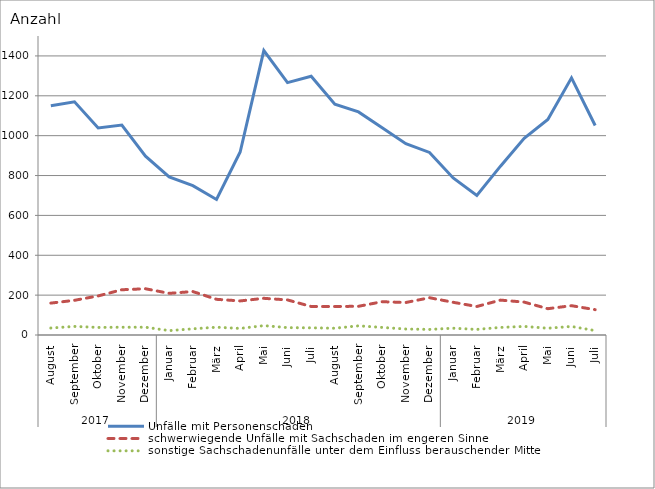
| Category | Unfälle mit Personenschaden | schwerwiegende Unfälle mit Sachschaden im engeren Sinne | sonstige Sachschadenunfälle unter dem Einfluss berauschender Mittel |
|---|---|---|---|
| 0 | 1150 | 160 | 35 |
| 1 | 1170 | 174 | 43 |
| 2 | 1039 | 196 | 38 |
| 3 | 1053 | 227 | 39 |
| 4 | 897 | 232 | 39 |
| 5 | 793 | 209 | 22 |
| 6 | 749 | 218 | 31 |
| 7 | 680 | 179 | 39 |
| 8 | 918 | 171 | 33 |
| 9 | 1427 | 184 | 47 |
| 10 | 1266 | 176 | 37 |
| 11 | 1298 | 143 | 36 |
| 12 | 1158 | 143 | 34 |
| 13 | 1119 | 144 | 46 |
| 14 | 1040 | 167 | 38 |
| 15 | 960 | 163 | 30 |
| 16 | 916 | 187 | 28 |
| 17 | 788 | 164 | 34 |
| 18 | 700 | 143 | 28 |
| 19 | 847 | 175 | 38 |
| 20 | 987 | 165 | 43 |
| 21 | 1081 | 132 | 34 |
| 22 | 1290 | 147 | 43 |
| 23 | 1051 | 127 | 22 |